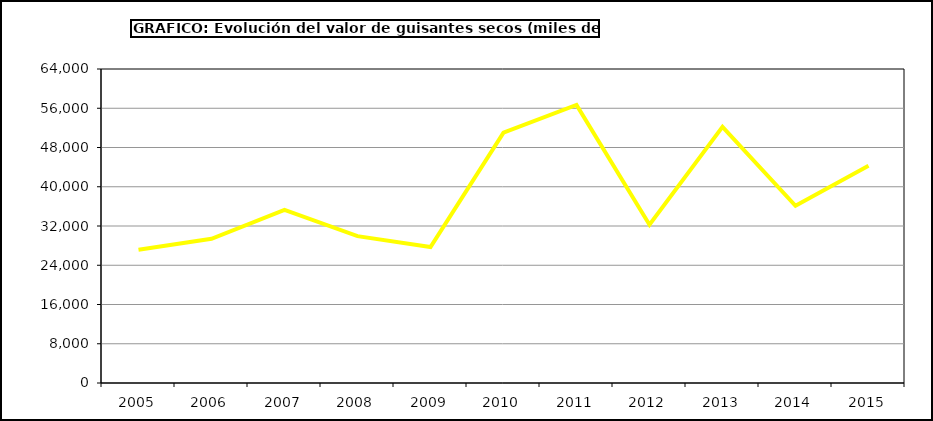
| Category | Valor |
|---|---|
| 2005.0 | 27163.868 |
| 2006.0 | 29383.981 |
| 2007.0 | 35293.602 |
| 2008.0 | 29934.579 |
| 2009.0 | 27725.625 |
| 2010.0 | 51044.567 |
| 2011.0 | 56666.277 |
| 2012.0 | 32251.03 |
| 2013.0 | 52203.832 |
| 2014.0 | 36116.283 |
| 2015.0 | 44267 |